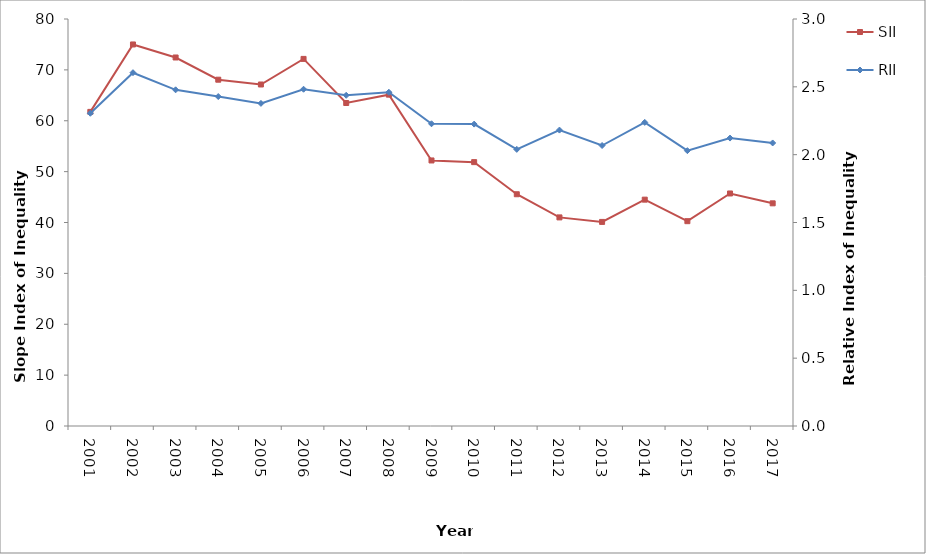
| Category | SII |
|---|---|
| 2001.0 | 61.742 |
| 2002.0 | 74.995 |
| 2003.0 | 72.434 |
| 2004.0 | 68.068 |
| 2005.0 | 67.126 |
| 2006.0 | 72.159 |
| 2007.0 | 63.487 |
| 2008.0 | 65.131 |
| 2009.0 | 52.194 |
| 2010.0 | 51.865 |
| 2011.0 | 45.554 |
| 2012.0 | 41.003 |
| 2013.0 | 40.117 |
| 2014.0 | 44.493 |
| 2015.0 | 40.26 |
| 2016.0 | 45.705 |
| 2017.0 | 43.768 |